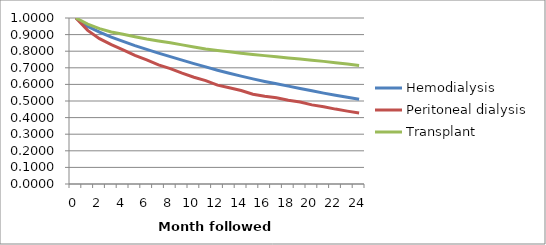
| Category | Hemodialysis | Peritoneal dialysis | Transplant |
|---|---|---|---|
| 0.0 | 1 | 1 | 1 |
| 1.0 | 0.949 | 0.925 | 0.963 |
| 2.0 | 0.914 | 0.876 | 0.936 |
| 3.0 | 0.884 | 0.84 | 0.916 |
| 4.0 | 0.859 | 0.808 | 0.902 |
| 5.0 | 0.833 | 0.774 | 0.887 |
| 6.0 | 0.811 | 0.748 | 0.873 |
| 7.0 | 0.788 | 0.718 | 0.861 |
| 8.0 | 0.767 | 0.695 | 0.851 |
| 9.0 | 0.746 | 0.668 | 0.838 |
| 10.0 | 0.725 | 0.643 | 0.825 |
| 11.0 | 0.706 | 0.623 | 0.813 |
| 12.0 | 0.685 | 0.596 | 0.805 |
| 13.0 | 0.667 | 0.58 | 0.796 |
| 14.0 | 0.65 | 0.563 | 0.787 |
| 15.0 | 0.633 | 0.541 | 0.781 |
| 16.0 | 0.618 | 0.528 | 0.773 |
| 17.0 | 0.604 | 0.519 | 0.766 |
| 18.0 | 0.589 | 0.505 | 0.759 |
| 19.0 | 0.575 | 0.494 | 0.752 |
| 20.0 | 0.562 | 0.477 | 0.746 |
| 21.0 | 0.547 | 0.465 | 0.739 |
| 22.0 | 0.535 | 0.451 | 0.731 |
| 23.0 | 0.522 | 0.439 | 0.722 |
| 24.0 | 0.51 | 0.428 | 0.714 |